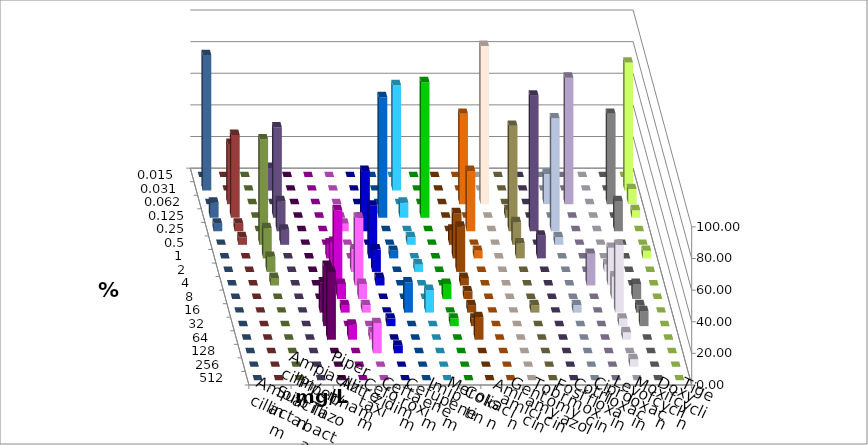
| Category | Ampicillin | Ampicillin/ Sulbactam | Piperacillin | Piperacillin/ Tazobactam | Aztreonam | Cefotaxim | Ceftazidim | Cefuroxim | Imipenem | Meropenem | Colistin | Amikacin | Gentamicin | Tobramycin | Fosfomycin | Cotrimoxazol | Ciprofloxacin | Levofloxacin | Moxifloxacin | Doxycyclin | Tigecyclin |
|---|---|---|---|---|---|---|---|---|---|---|---|---|---|---|---|---|---|---|---|---|---|
| 0.015 | 0 | 0 | 0 | 0 | 0 | 0 | 0 | 0 | 0 | 0 | 0 | 0 | 0 | 0 | 0 | 0 | 0 | 0 | 0 | 0 | 0 |
| 0.031 | 0 | 0 | 0 | 0 | 0 | 66.667 | 0 | 0 | 0 | 0 | 0 | 0 | 0 | 0 | 0 | 0 | 80.952 | 85.714 | 0 | 0 | 14.286 |
| 0.062 | 0 | 0 | 0 | 0 | 0 | 0 | 0 | 0 | 57.143 | 100 | 0 | 0 | 19.048 | 80 | 0 | 57.143 | 9.524 | 0 | 38.095 | 0 | 0 |
| 0.125 | 0 | 0 | 0 | 0 | 76.19 | 9.524 | 85.714 | 0 | 0 | 0 | 4.762 | 0 | 0 | 0 | 0 | 0 | 4.762 | 9.524 | 52.381 | 0 | 57.143 |
| 0.25 | 0 | 0 | 4.762 | 38.095 | 0 | 0 | 0 | 0 | 38.095 | 0 | 66.667 | 85.714 | 71.429 | 0 | 0 | 19.048 | 0 | 4.762 | 4.762 | 0 | 19.048 |
| 0.5 | 0 | 0 | 0 | 0 | 0 | 4.762 | 0 | 9.524 | 0 | 0 | 14.286 | 0 | 4.762 | 0 | 0 | 0 | 0 | 0 | 4.762 | 66.667 | 9.524 |
| 1.0 | 0 | 9.524 | 0 | 33.333 | 4.762 | 0 | 0 | 28.571 | 4.762 | 0 | 9.524 | 14.286 | 0 | 0 | 0 | 0 | 4.762 | 0 | 0 | 19.048 | 0 |
| 2.0 | 0 | 19.048 | 14.286 | 14.286 | 0 | 4.762 | 0 | 28.571 | 0 | 0 | 0 | 0 | 0 | 0 | 4.762 | 0 | 0 | 0 | 0 | 9.524 | 0 |
| 4.0 | 0 | 47.619 | 42.857 | 4.762 | 0 | 0 | 0 | 4.762 | 0 | 0 | 0 | 0 | 0 | 20 | 23.81 | 0 | 0 | 0 | 0 | 4.762 | 0 |
| 8.0 | 0 | 9.524 | 9.524 | 0 | 0 | 0 | 9.524 | 4.762 | 0 | 0 | 0 | 0 | 0 | 0 | 14.286 | 9.524 | 0 | 0 | 0 | 0 | 0 |
| 16.0 | 19.048 | 4.762 | 4.762 | 0 | 19.048 | 14.286 | 0 | 4.762 | 0 | 0 | 4.762 | 0 | 4.762 | 0 | 42.857 | 4.762 | 0 | 0 | 0 | 0 | 0 |
| 32.0 | 38.095 | 0 | 0 | 4.762 | 0 | 0 | 4.762 | 4.762 | 0 | 0 | 0 | 0 | 0 | 0 | 4.762 | 9.524 | 0 | 0 | 0 | 0 | 0 |
| 64.0 | 42.857 | 9.524 | 4.762 | 0 | 0 | 0 | 0 | 14.286 | 0 | 0 | 0 | 0 | 0 | 0 | 4.762 | 0 | 0 | 0 | 0 | 0 | 0 |
| 128.0 | 0 | 0 | 19.048 | 4.762 | 0 | 0 | 0 | 0 | 0 | 0 | 0 | 0 | 0 | 0 | 0 | 0 | 0 | 0 | 0 | 0 | 0 |
| 256.0 | 0 | 0 | 0 | 0 | 0 | 0 | 0 | 0 | 0 | 0 | 0 | 0 | 0 | 0 | 4.762 | 0 | 0 | 0 | 0 | 0 | 0 |
| 512.0 | 0 | 0 | 0 | 0 | 0 | 0 | 0 | 0 | 0 | 0 | 0 | 0 | 0 | 0 | 0 | 0 | 0 | 0 | 0 | 0 | 0 |